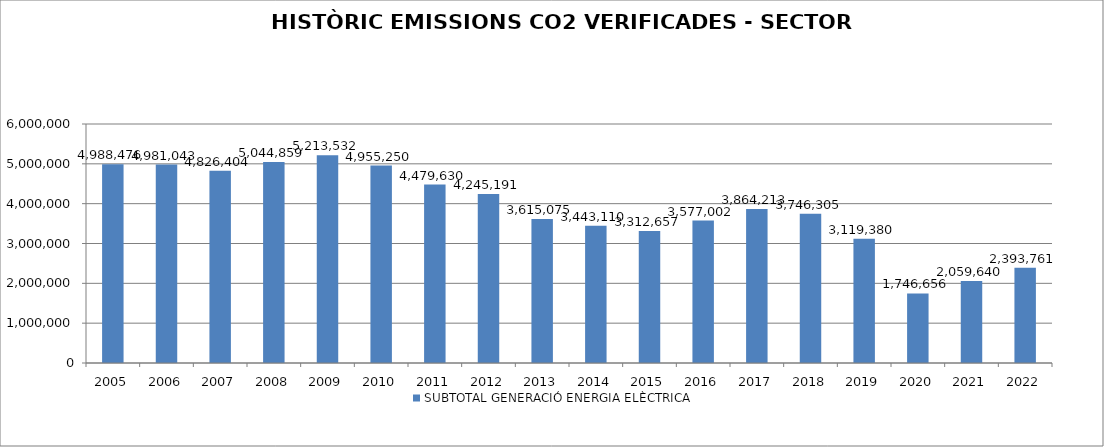
| Category | SUBTOTAL GENERACIÓ ENERGIA ELÈCTRICA  |
|---|---|
| 2005.0 | 4988476 |
| 2006.0 | 4981043 |
| 2007.0 | 4826404 |
| 2008.0 | 5044859 |
| 2009.0 | 5213532 |
| 2010.0 | 4955250 |
| 2011.0 | 4479630 |
| 2012.0 | 4245191 |
| 2013.0 | 3615075 |
| 2014.0 | 3443110 |
| 2015.0 | 3312657 |
| 2016.0 | 3577002 |
| 2017.0 | 3864213 |
| 2018.0 | 3746305 |
| 2019.0 | 3119380 |
| 2020.0 | 1746656 |
| 2021.0 | 2059640 |
| 2022.0 | 2393761 |